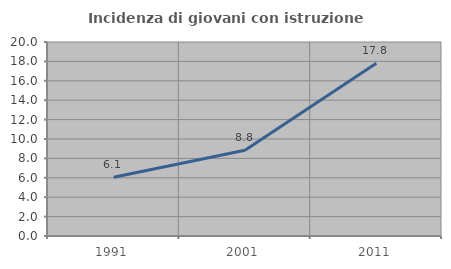
| Category | Incidenza di giovani con istruzione universitaria |
|---|---|
| 1991.0 | 6.066 |
| 2001.0 | 8.837 |
| 2011.0 | 17.808 |